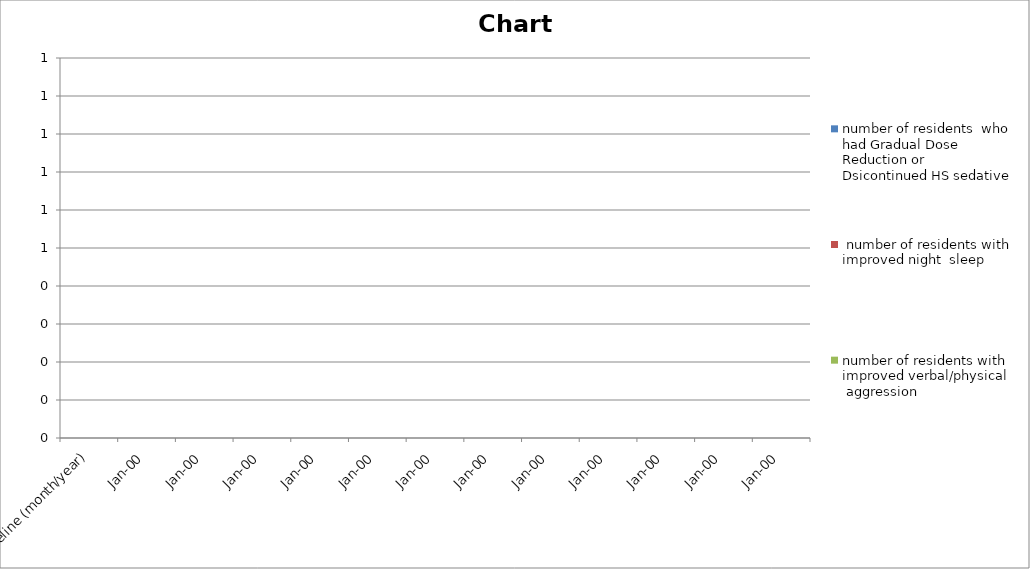
| Category | number of residents  who had Gradual Dose Reduction or Dsicontinued HS sedative |  number of residents with improved night  sleep | number of residents with improved verbal/physical  aggression  |
|---|---|---|---|
| Baseline (month/year) | 0 | 0 | 0 |
| Jan-00 | 0 | 0 | 0 |
| Jan-00 | 0 | 0 | 0 |
| Jan-00 | 0 | 0 | 0 |
| Jan-00 | 0 | 0 | 0 |
| Jan-00 | 0 | 0 | 0 |
| Jan-00 | 0 | 0 | 0 |
| Jan-00 | 0 | 0 | 0 |
| Jan-00 | 0 | 0 | 0 |
| Jan-00 | 0 | 0 | 0 |
| Jan-00 | 0 | 0 | 0 |
| Jan-00 | 0 | 0 | 0 |
| Jan-00 | 0 | 0 | 0 |